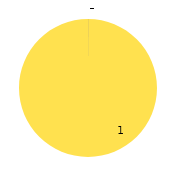
| Category | Saturday | Department |
|---|---|---|
| 0 | 0 | 0 |
| 1 | 0 | 0 |
| 2 | 0 | 0 |
| 3 | 0 | 0 |
| 4 | 1 | 0 |
| 5 | 0 | 0 |
| 6 | 0 | 0 |
| 7 | 0 | 0 |
| 8 | 0 | 0 |
| 9 | 0 | 0 |
| 10 | 0 | 0 |
| 11 | 0 | 0 |
| 12 | 0 | 0 |
| 13 | 0 | 0 |
| 14 | 0 | 0 |
| 15 | 0 | 0 |
| 16 | 0 | 0 |
| 17 | 0 | 0 |
| 18 | 0 | 0 |
| 19 | 0 | 0 |